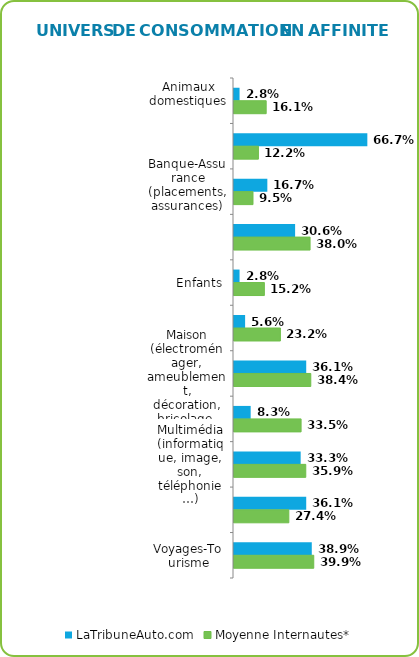
| Category | LaTribuneAuto.com | Moyenne Internautes* |
|---|---|---|
| Animaux domestiques | 0.028 | 0.161 |
| Auto-Moto | 0.667 | 0.122 |
| Banque-Assurance (placements, assurances) | 0.167 | 0.095 |
| Culture, loisirs (cinéma, musique, jeux…) | 0.306 | 0.38 |
| Enfants | 0.028 | 0.152 |
| Hygiène-Beauté | 0.056 | 0.232 |
| Maison (électroménager, ameublement, décoration, bricolage, jardinage...) | 0.361 | 0.384 |
| Mode (vêtements, chaussures et accessoires) | 0.083 | 0.335 |
| Multimédia (informatique, image, son, téléphonie…) | 0.333 | 0.359 |
| Sport | 0.361 | 0.274 |
| Voyages-Tourisme | 0.389 | 0.399 |